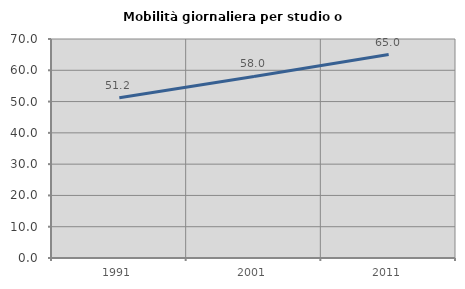
| Category | Mobilità giornaliera per studio o lavoro |
|---|---|
| 1991.0 | 51.221 |
| 2001.0 | 58.027 |
| 2011.0 | 65.032 |